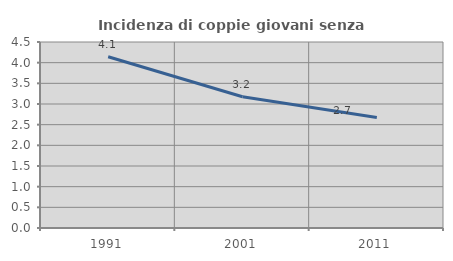
| Category | Incidenza di coppie giovani senza figli |
|---|---|
| 1991.0 | 4.143 |
| 2001.0 | 3.175 |
| 2011.0 | 2.674 |